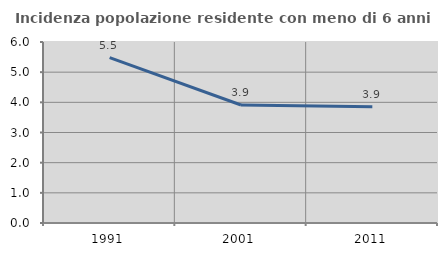
| Category | Incidenza popolazione residente con meno di 6 anni |
|---|---|
| 1991.0 | 5.482 |
| 2001.0 | 3.912 |
| 2011.0 | 3.852 |